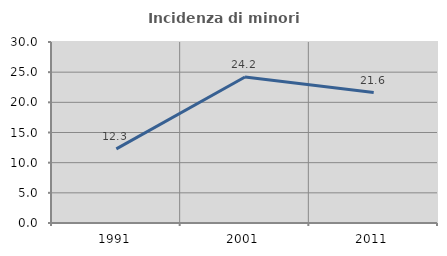
| Category | Incidenza di minori stranieri |
|---|---|
| 1991.0 | 12.281 |
| 2001.0 | 24.194 |
| 2011.0 | 21.626 |